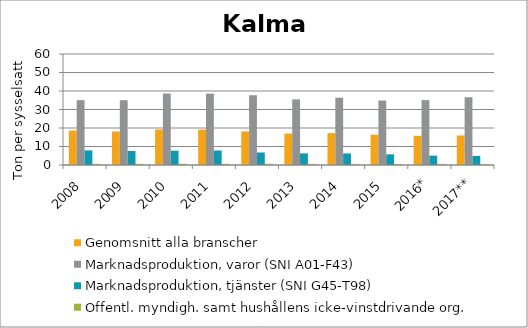
| Category | Genomsnitt alla branscher | Marknadsproduktion, varor (SNI A01-F43) | Marknadsproduktion, tjänster (SNI G45-T98) | Offentl. myndigh. samt hushållens icke-vinstdrivande org. |
|---|---|---|---|---|
| 2008 | 18.663 | 35.053 | 7.897 | 0.617 |
| 2009 | 18.095 | 35.012 | 7.566 | 0.64 |
| 2010 | 19.21 | 38.625 | 7.735 | 0.645 |
| 2011 | 19.123 | 38.58 | 7.828 | 0.632 |
| 2012 | 18.149 | 37.712 | 6.763 | 0.65 |
| 2013 | 16.985 | 35.479 | 6.276 | 0.58 |
| 2014 | 17.246 | 36.388 | 6.24 | 0.558 |
| 2015 | 16.386 | 34.844 | 5.757 | 0.561 |
| 2016* | 15.74 | 35.077 | 5.035 | 0.539 |
| 2017** | 15.95 | 36.631 | 4.93 | 0.514 |